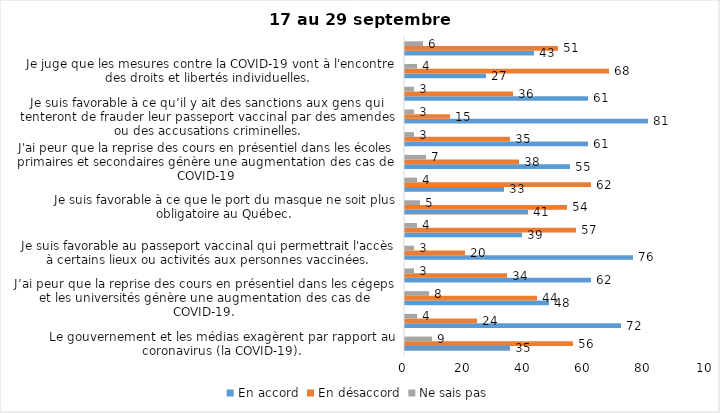
| Category | En accord | En désaccord | Ne sais pas |
|---|---|---|---|
| Le gouvernement et les médias exagèrent par rapport au coronavirus (la COVID-19). | 35 | 56 | 9 |
| J’ai peur que le système de santé soit débordé par les cas de COVID-19. | 72 | 24 | 4 |
| J’ai peur que la reprise des cours en présentiel dans les cégeps et les universités génère une augmentation des cas de COVID-19. | 48 | 44 | 8 |
| Je suis inquiet/inquiète  que le nombre de cas augmente en raison des nouveaux variants du virus de la COVID-19 | 62 | 34 | 3 |
| Je suis favorable au passeport vaccinal qui permettrait l'accès à certains lieux ou activités aux personnes vaccinées. | 76 | 20 | 3 |
| Si les cas de COVID-19 augmentent cet automne, je suis favorable à la mise en place de mesures de confinement (ex. fermeture de services non essentiels, interdiction des rassemblements privés) | 39 | 57 | 4 |
| Je suis favorable à ce que le port du masque ne soit plus obligatoire au Québec. | 41 | 54 | 5 |
| Étant donné la progression de la vaccination, je pense qu’il est moins important de suivre les mesures de prévention. | 33 | 62 | 4 |
| J'ai peur que la reprise des cours en présentiel dans les écoles primaires et secondaires génère une augmentation des cas de COVID-19 | 55 | 38 | 7 |
| Je suis favorable à ce qu’il y ait des sanctions aux commerçants qui ne vérifieront pas le passeport vaccinal (code QR) de leurs clients | 61 | 35 | 3 |
| Je suis favorable à ce qu’il y ait des sanctions aux gens qui tenteront de frauder leur passeport vaccinal par des amendes ou des accusations criminelles. | 81 | 15 | 3 |
| Je crois que le passeport vaccinal devrait être requis pour davantage de services et commerces (ex. : spas, centre d’achats, centre de soins personnels. | 61 | 36 | 3 |
| Je juge que les mesures contre la COVID-19 vont à l'encontre des droits et libertés individuelles.  | 27 | 68 | 4 |
| Je pense que le gouvernement du Québec devrait mettre fin à l’état d’urgence sanitaire.  | 43 | 51 | 6 |